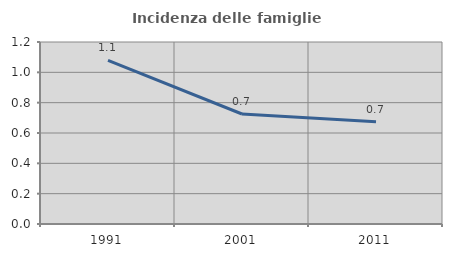
| Category | Incidenza delle famiglie numerose |
|---|---|
| 1991.0 | 1.079 |
| 2001.0 | 0.725 |
| 2011.0 | 0.674 |